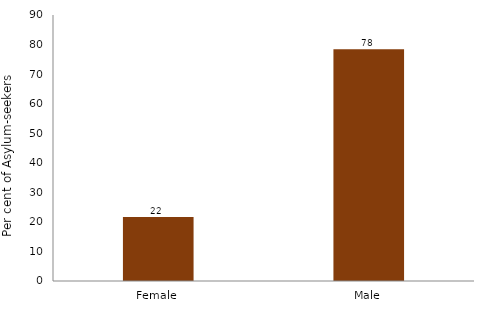
| Category | Series 0 |
|---|---|
| Female | 21.617 |
| Male | 78.383 |